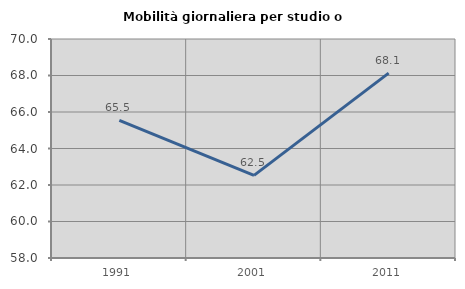
| Category | Mobilità giornaliera per studio o lavoro |
|---|---|
| 1991.0 | 65.539 |
| 2001.0 | 62.526 |
| 2011.0 | 68.128 |